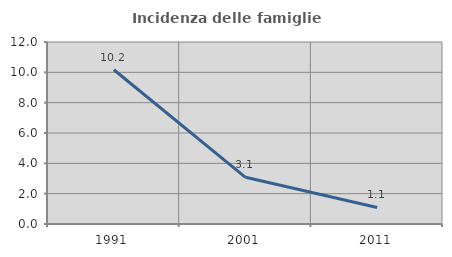
| Category | Incidenza delle famiglie numerose |
|---|---|
| 1991.0 | 10.169 |
| 2001.0 | 3.08 |
| 2011.0 | 1.093 |